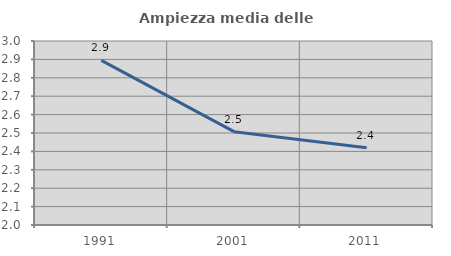
| Category | Ampiezza media delle famiglie |
|---|---|
| 1991.0 | 2.894 |
| 2001.0 | 2.507 |
| 2011.0 | 2.419 |